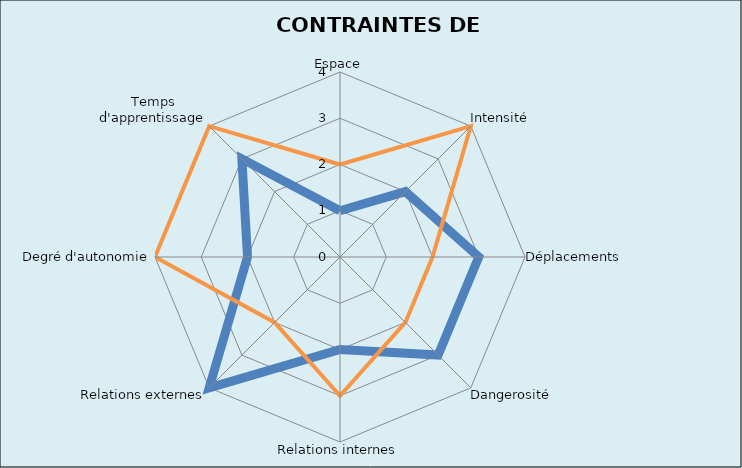
| Category | Series 0 | Series 1 |
|---|---|---|
| Espace | 1 | 2 |
| Intensité | 2 | 4 |
| Déplacements | 3 | 2 |
| Dangerosité | 3 | 2 |
| Relations internes | 2 | 3 |
| Relations externes | 4 | 2 |
| Degré d'autonomie | 2 | 4 |
| Temps d'apprentissage | 3 | 4 |